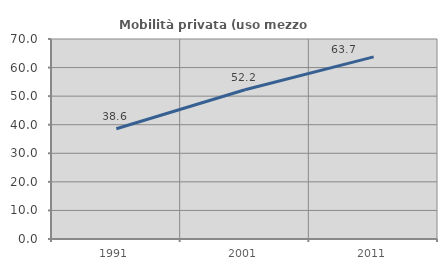
| Category | Mobilità privata (uso mezzo privato) |
|---|---|
| 1991.0 | 38.595 |
| 2001.0 | 52.22 |
| 2011.0 | 63.738 |